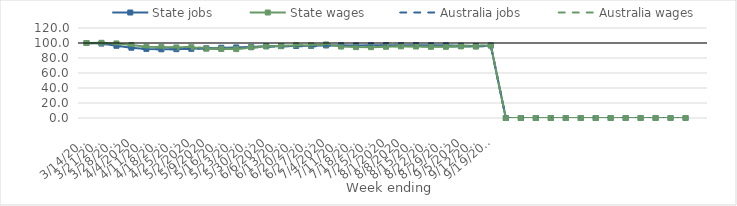
| Category | State jobs | State wages | Australia jobs | Australia wages |
|---|---|---|---|---|
| 14/03/2020 | 100 | 100 | 100 | 100 |
| 21/03/2020 | 99.247 | 100.29 | 99.278 | 99.672 |
| 28/03/2020 | 96.294 | 99.417 | 96.309 | 98.416 |
| 04/04/2020 | 93.718 | 97.391 | 93.652 | 96.688 |
| 11/04/2020 | 92.158 | 94.907 | 91.928 | 94.131 |
| 18/04/2020 | 91.582 | 94.55 | 91.47 | 94.024 |
| 25/04/2020 | 91.74 | 94.094 | 91.802 | 94.259 |
| 02/05/2020 | 92.229 | 94.389 | 92.199 | 94.709 |
| 09/05/2020 | 92.93 | 92.49 | 92.746 | 93.35 |
| 16/05/2020 | 93.652 | 92.015 | 93.278 | 92.689 |
| 23/05/2020 | 94.077 | 91.862 | 93.582 | 92.309 |
| 30/05/2020 | 94.719 | 94.29 | 94.088 | 93.584 |
| 06/06/2020 | 95.785 | 95.528 | 95.005 | 95.392 |
| 13/06/2020 | 95.789 | 95.961 | 95.464 | 96.09 |
| 20/06/2020 | 95.959 | 97.061 | 95.655 | 97.004 |
| 27/06/2020 | 96.18 | 96.692 | 95.595 | 97.247 |
| 04/07/2020 | 96.72 | 98.087 | 96.297 | 98.874 |
| 11/07/2020 | 96.974 | 95.27 | 96.584 | 95.79 |
| 18/07/2020 | 96.736 | 94.526 | 96.449 | 95.216 |
| 25/07/2020 | 96.914 | 94.432 | 96.501 | 94.86 |
| 01/08/2020 | 97.068 | 94.969 | 96.569 | 95.541 |
| 08/08/2020 | 97.011 | 95.505 | 96.344 | 95.915 |
| 15/08/2020 | 97.047 | 95.294 | 96.168 | 95.478 |
| 22/08/2020 | 96.859 | 94.919 | 96.063 | 95.259 |
| 29/08/2020 | 96.859 | 94.953 | 95.951 | 95.312 |
| 05/09/2020 | 96.38 | 95.478 | 95.576 | 96.393 |
| 12/09/2020 | 96.141 | 95.204 | 95.53 | 96.207 |
| 19/09/2020 | 96.683 | 96.588 | 95.881 | 97.123 |